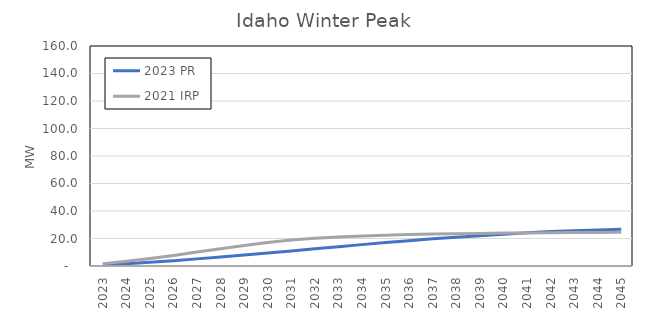
| Category | 2023 PR | 2021 IRP |
|---|---|---|
| 2023.0 | 0.723 | 1.643 |
| 2024.0 | 1.612 | 3.427 |
| 2025.0 | 2.656 | 5.431 |
| 2026.0 | 3.867 | 7.691 |
| 2027.0 | 5.179 | 10.121 |
| 2028.0 | 6.568 | 12.599 |
| 2029.0 | 7.996 | 14.958 |
| 2030.0 | 9.409 | 17.078 |
| 2031.0 | 10.94 | 18.84 |
| 2032.0 | 12.499 | 20.16 |
| 2033.0 | 14.029 | 21.147 |
| 2034.0 | 15.546 | 21.869 |
| 2035.0 | 17.016 | 22.419 |
| 2036.0 | 18.443 | 22.85 |
| 2037.0 | 19.799 | 23.185 |
| 2038.0 | 20.957 | 23.461 |
| 2039.0 | 22.064 | 23.724 |
| 2040.0 | 23.116 | 23.974 |
| 2041.0 | 24.118 | 24.09 |
| 2042.0 | 25.112 | 24.202 |
| 2043.0 | 25.678 | 24.318 |
| 2044.0 | 26.241 | 24.435 |
| 2045.0 | 26.684 | 24.517 |